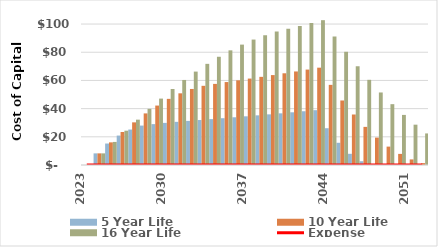
| Category | 5 Year Life | 10 Year Life | 16 Year Life |
|---|---|---|---|
| 2023.0 | 0 | 0 | 0 |
| 2024.0 | 8.251 | 8.251 | 8.251 |
| 2025.0 | 15.233 | 16.058 | 16.367 |
| 2026.0 | 20.887 | 23.4 | 24.343 |
| 2027.0 | 25.153 | 30.258 | 32.172 |
| 2028.0 | 27.968 | 36.609 | 39.849 |
| 2029.0 | 29.003 | 42.169 | 47.107 |
| 2030.0 | 29.873 | 46.923 | 53.935 |
| 2031.0 | 30.618 | 50.853 | 60.326 |
| 2032.0 | 31.281 | 53.944 | 66.272 |
| 2033.0 | 31.906 | 56.179 | 71.762 |
| 2034.0 | 32.544 | 57.541 | 76.789 |
| 2035.0 | 33.195 | 58.837 | 81.342 |
| 2036.0 | 33.859 | 60.087 | 85.413 |
| 2037.0 | 34.536 | 61.314 | 88.991 |
| 2038.0 | 35.227 | 62.54 | 92.067 |
| 2039.0 | 35.932 | 63.791 | 94.631 |
| 2040.0 | 36.65 | 65.067 | 96.672 |
| 2041.0 | 37.383 | 66.368 | 98.697 |
| 2042.0 | 38.131 | 67.695 | 100.717 |
| 2043.0 | 38.893 | 69.049 | 102.746 |
| 2044.0 | 26.098 | 56.857 | 91.228 |
| 2045.0 | 15.761 | 45.778 | 80.327 |
| 2046.0 | 7.932 | 35.835 | 70.057 |
| 2047.0 | 2.661 | 27.05 | 60.43 |
| 2048.0 | 0 | 19.447 | 51.458 |
| 2049.0 | 0 | 13.049 | 43.156 |
| 2050.0 | 0 | 7.881 | 35.535 |
| 2051.0 | 0 | 3.966 | 28.611 |
| 2052.0 | 0 | 1.331 | 22.397 |